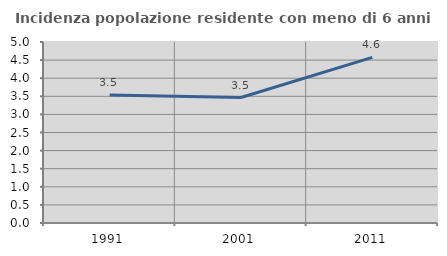
| Category | Incidenza popolazione residente con meno di 6 anni |
|---|---|
| 1991.0 | 3.539 |
| 2001.0 | 3.466 |
| 2011.0 | 4.576 |